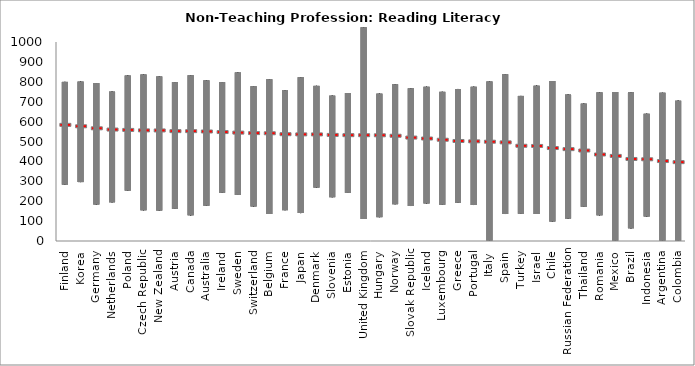
| Category | min | mean | max |
|---|---|---|---|
| Finland | 283.285 | 586.153 | 799.484 |
| Korea | 296.109 | 578.969 | 800.888 |
| Germany | 183.479 | 568.754 | 793.658 |
| Netherlands | 194.709 | 562.587 | 750.52 |
| Poland | 253.229 | 560.708 | 831.315 |
| Czech Republic | 154.604 | 558.393 | 836.241 |
| New Zealand | 153.683 | 558.098 | 826.215 |
| Austria | 161.711 | 554.613 | 798.25 |
| Canada | 128.957 | 554.527 | 833.26 |
| Australia | 177.311 | 552.874 | 807.244 |
| Ireland | 242.61 | 549.988 | 798.332 |
| Sweden | 231.564 | 547.15 | 846.845 |
| Switzerland | 173.662 | 544.659 | 778.057 |
| Belgium | 135.862 | 543.89 | 812.303 |
| France | 155.012 | 539.202 | 756.887 |
| Japan | 140.231 | 538.251 | 822.815 |
| Denmark | 268.603 | 538.119 | 779.496 |
| Slovenia | 220.191 | 535.583 | 730.065 |
| Estonia | 241.777 | 534.338 | 743.592 |
| United Kingdom | 110.888 | 534.14 | 1074.562 |
| Hungary | 119.866 | 533.742 | 740.221 |
| Norway | 184.997 | 531.4 | 787.299 |
| Slovak Republic | 175.779 | 522.221 | 767.074 |
| Iceland | 188.823 | 517.473 | 774.941 |
| Luxembourg | 182.116 | 511.335 | 749.499 |
| Greece | 192.226 | 505.071 | 763.91 |
| Portugal | 180.752 | 503.22 | 774.941 |
| Italy | 1.02 | 501.473 | 800.881 |
| Spain | 135.592 | 498.163 | 837.986 |
| Turkey | 136.958 | 481.037 | 728.942 |
| Israel | 135.745 | 480.137 | 780.489 |
| Chile | 98.165 | 469.634 | 803.793 |
| Russian Federation | 112.795 | 464.173 | 735.737 |
| Thailand | 172.041 | 457.267 | 690.159 |
| Romania | 129.258 | 437.208 | 746.948 |
| Mexico | 1.02 | 430.046 | 748.242 |
| Brazil | 63.721 | 414.679 | 747.982 |
| Indonesia | 123.242 | 413.127 | 639.276 |
| Argentina | 1.02 | 404.218 | 744.541 |
| Colombia | 1.02 | 398.76 | 705.133 |